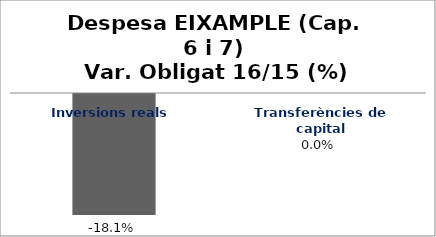
| Category | Series 0 |
|---|---|
| Inversions reals | -0.181 |
| Transferències de capital | 0 |